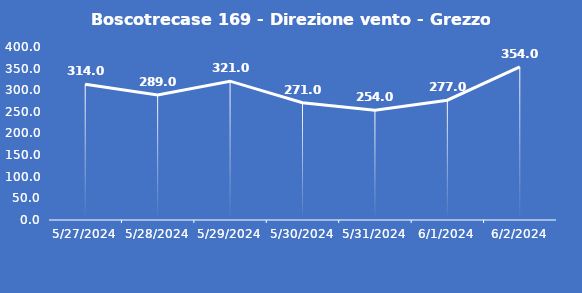
| Category | Boscotrecase 169 - Direzione vento - Grezzo (°N) |
|---|---|
| 5/27/24 | 314 |
| 5/28/24 | 289 |
| 5/29/24 | 321 |
| 5/30/24 | 271 |
| 5/31/24 | 254 |
| 6/1/24 | 277 |
| 6/2/24 | 354 |